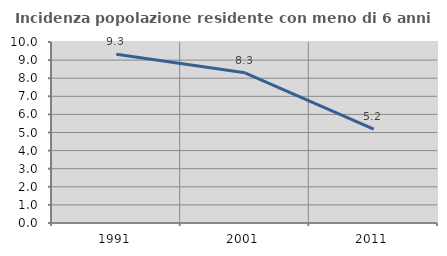
| Category | Incidenza popolazione residente con meno di 6 anni |
|---|---|
| 1991.0 | 9.324 |
| 2001.0 | 8.295 |
| 2011.0 | 5.189 |